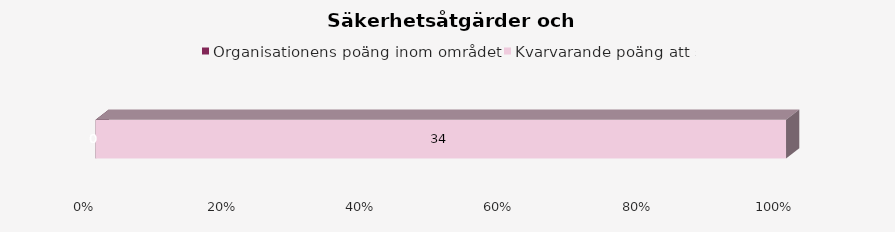
| Category | Organisationens poäng inom området | Kvarvarande poäng att samla |
|---|---|---|
| 0 | 0 | 34 |